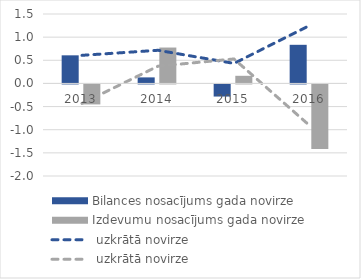
| Category | Bilances nosacījums | Izdevumu nosacījums |
|---|---|---|
| 2013.0 | 0.607 | -0.432 |
| 2014.0 | 0.131 | 0.775 |
| 2015.0 | -0.262 | 0.165 |
| 2016.0 | 0.834 | -1.393 |